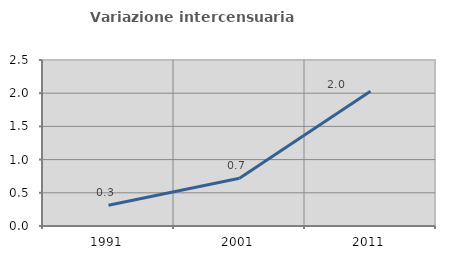
| Category | Variazione intercensuaria annua |
|---|---|
| 1991.0 | 0.313 |
| 2001.0 | 0.718 |
| 2011.0 | 2.031 |